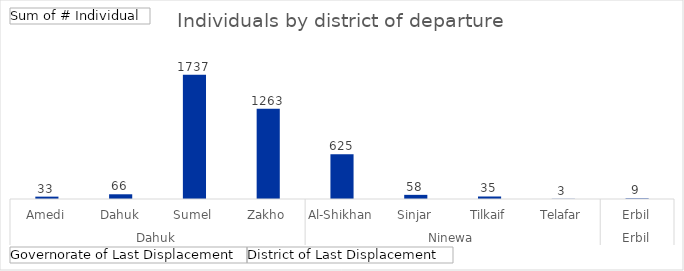
| Category | Total |
|---|---|
| 0 | 33 |
| 1 | 66 |
| 2 | 1737 |
| 3 | 1263 |
| 4 | 625 |
| 5 | 58 |
| 6 | 35 |
| 7 | 3 |
| 8 | 9 |